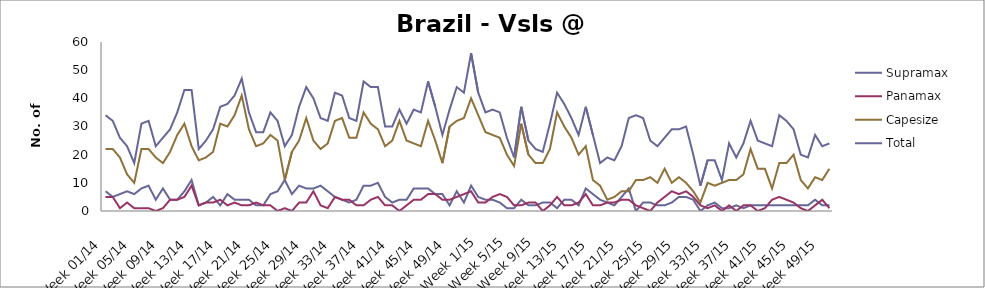
| Category | Supramax | Panamax | Capesize | Total |
|---|---|---|---|---|
| Week 01/14 | 7 | 5 | 22 | 34 |
| Week 02/14 | 5 | 5 | 22 | 32 |
| Week 03/14 | 6 | 1 | 19 | 26 |
| Week 04/14 | 7 | 3 | 13 | 23 |
| Week 05/14 | 6 | 1 | 10 | 17 |
| Week 06/14 | 8 | 1 | 22 | 31 |
| Week 07/14 | 9 | 1 | 22 | 32 |
| Week 08/14 | 4 | 0 | 19 | 23 |
| Week 09/14 | 8 | 1 | 17 | 26 |
| Week 10/14 | 4 | 4 | 21 | 29 |
| Week 11/14 | 4 | 4 | 27 | 35 |
| Week 12/14 | 7 | 5 | 31 | 43 |
| Week 13/14 | 11 | 9 | 23 | 43 |
| Week 14/14 | 2 | 2 | 18 | 22 |
| Week 15/14 | 3 | 3 | 19 | 25 |
| Week 16/14 | 5 | 3 | 21 | 29 |
| Week 17/14 | 2 | 4 | 31 | 37 |
| Week 18/14 | 6 | 2 | 30 | 38 |
| Week 19/14 | 4 | 3 | 34 | 41 |
| Week 20/14 | 4 | 2 | 41 | 47 |
| Week 21/14 | 4 | 2 | 29 | 35 |
| Week 22/14 | 2 | 3 | 23 | 28 |
| Week 23/14 | 2 | 2 | 24 | 28 |
| Week 24/14 | 6 | 2 | 27 | 35 |
| Week 25/14 | 7 | 0 | 25 | 32 |
| Week 26/14 | 11 | 1 | 11 | 23 |
| Week 27/14 | 6 | 0 | 21 | 27 |
| Week 28/14 | 9 | 3 | 25 | 37 |
| Week 29/14 | 8 | 3 | 33 | 44 |
| Week 30/14 | 8 | 7 | 25 | 40 |
| Week 31/14 | 9 | 2 | 22 | 33 |
| Week 32/14 | 7 | 1 | 24 | 32 |
| Week 33/14 | 5 | 5 | 32 | 42 |
| Week 34/14 | 4 | 4 | 33 | 41 |
| Week 35/14 | 3 | 4 | 26 | 33 |
| Week 36/14 | 4 | 2 | 26 | 32 |
| Week 37/14 | 9 | 2 | 35 | 46 |
| Week 38/14 | 9 | 4 | 31 | 44 |
| Week 39/14 | 10 | 5 | 29 | 44 |
| Week 40/14 | 5 | 2 | 23 | 30 |
| Week 41/14 | 3 | 2 | 25 | 30 |
| Week 42/14 | 4 | 0 | 32 | 36 |
| Week 43/14 | 4 | 2 | 25 | 31 |
| Week 44/14 | 8 | 4 | 24 | 36 |
| Week 45/14 | 8 | 4 | 23 | 35 |
| Week 46/14 | 8 | 6 | 32 | 46 |
| Week 47/14 | 6 | 6 | 25 | 37 |
| Week 48/14 | 6 | 4 | 17 | 27 |
| Week 49/14 | 2 | 4 | 30 | 36 |
| Week 50/14 | 7 | 5 | 32 | 44 |
| Week 51/14 | 3 | 6 | 33 | 42 |
| Week 52/14 | 9 | 7 | 40 | 56 |
| Week 1/15 | 5 | 3 | 34 | 42 |
| Week 2/15 | 4 | 3 | 28 | 35 |
| Week 3/15 | 4 | 5 | 27 | 36 |
| Week 4/15 | 3 | 6 | 26 | 35 |
| Week 5/15 | 1 | 5 | 20 | 26 |
| Week 6/15 | 1 | 2 | 16 | 19 |
| Week 7/15 | 4 | 2 | 31 | 37 |
| Week 8/15 | 2 | 3 | 20 | 25 |
| Week 9/15 | 2 | 3 | 17 | 22 |
| Week 10/15 | 3 | 0 | 17 | 21 |
| Week 11/15 | 3 | 2 | 22 | 31 |
| Week 12/15 | 1 | 5 | 35 | 42 |
| Week 13/15 | 4 | 2 | 30 | 38 |
| Week 14/15 | 4 | 2 | 26 | 33 |
| Week 15/15 | 2 | 3 | 20 | 27 |
| Week 16/15 | 8 | 6 | 23 | 37 |
| Week 17/15 | 6 | 2 | 11 | 27 |
| Week 18/15 | 4 | 2 | 9 | 17 |
| Week 19/15 | 3 | 3 | 4 | 19 |
| Week 20/15 | 2 | 3 | 5 | 18 |
| Week 21/15 | 5 | 4 | 7 | 23 |
| Week 22/15 | 8 | 4 | 7 | 33 |
| Week 23/15 | 0 | 2 | 11 | 34 |
| Week 24/15 | 3 | 1 | 11 | 33 |
| Week 25/15 | 3 | 0 | 12 | 25 |
| Week 26/15 | 2 | 3 | 10 | 23 |
| Week 27/15 | 2 | 5 | 15 | 26 |
| Week 28/15 | 3 | 7 | 10 | 29 |
| Week 29/15 | 5 | 6 | 12 | 29 |
| Week 30/15 | 5 | 7 | 10 | 30 |
| Week 31/15 | 4 | 5 | 7 | 20 |
| Week 32/15 | 0 | 2 | 3 | 9 |
| Week 33/15 | 2 | 1 | 10 | 18 |
| Week 34/15 | 3 | 2 | 9 | 18 |
| Week 35/15 | 1 | 0 | 10 | 11 |
| Week 36/15 | 1 | 2 | 11 | 24 |
| Week 37/15 | 2 | 0 | 11 | 19 |
| Week 38/15 | 1 | 2 | 13 | 24 |
| Week 39/15 | 2 | 2 | 22 | 32 |
| Week 40/15 | 2 | 0 | 15 | 25 |
| Week 41/15 | 2 | 1 | 15 | 24 |
| Week 42/15 | 2 | 4 | 8 | 23 |
| Week 43/15 | 2 | 5 | 17 | 34 |
| Week 44/15 | 2 | 4 | 17 | 32 |
| Week 45/15 | 2 | 3 | 20 | 29 |
| Week 46/15 | 2 | 1 | 11 | 20 |
| Week 47/15 | 2 | 0 | 8 | 19 |
| Week 48/15 | 4 | 2 | 12 | 27 |
| Week 49/15 | 2 | 4 | 11 | 23 |
| Week 50/15 | 2 | 1 | 15 | 24 |